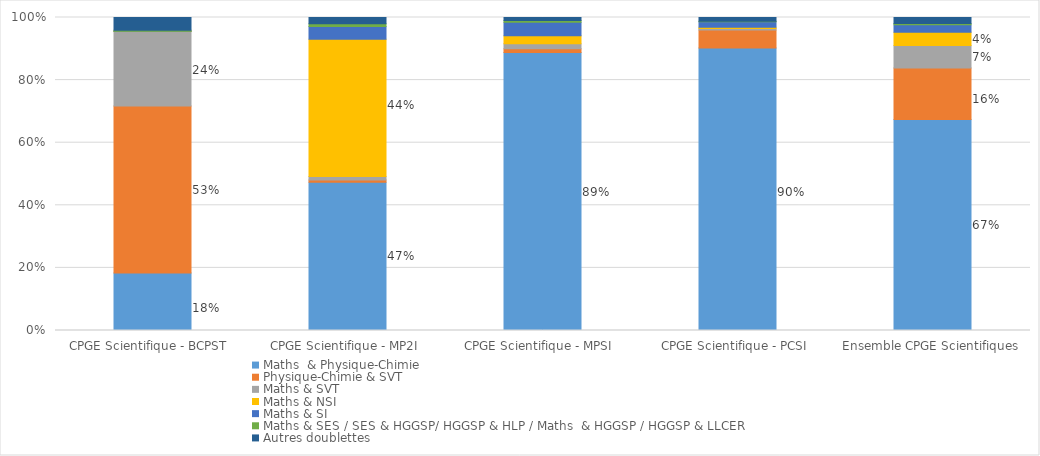
| Category | Maths  & Physique-Chimie  | Physique-Chimie & SVT | Maths & SVT | Maths & NSI | Maths & SI | Maths & SES / SES & HGGSP/ HGGSP & HLP / Maths  & HGGSP / HGGSP & LLCER  | Autres doublettes |
|---|---|---|---|---|---|---|---|
| CPGE Scientifique - BCPST  | 0.184 | 0.534 | 0.238 | 0.001 | 0.001 | 0.003 | 0.04 |
| CPGE Scientifique - MP2I  | 0.473 | 0.008 | 0.011 | 0.439 | 0.041 | 0.008 | 0.02 |
| CPGE Scientifique - MPSI  | 0.888 | 0.012 | 0.016 | 0.026 | 0.043 | 0.005 | 0.01 |
| CPGE Scientifique - PCSI  | 0.902 | 0.057 | 0.005 | 0.004 | 0.017 | 0.002 | 0.012 |
| Ensemble CPGE Scientifiques | 0.674 | 0.164 | 0.072 | 0.042 | 0.024 | 0.004 | 0.019 |